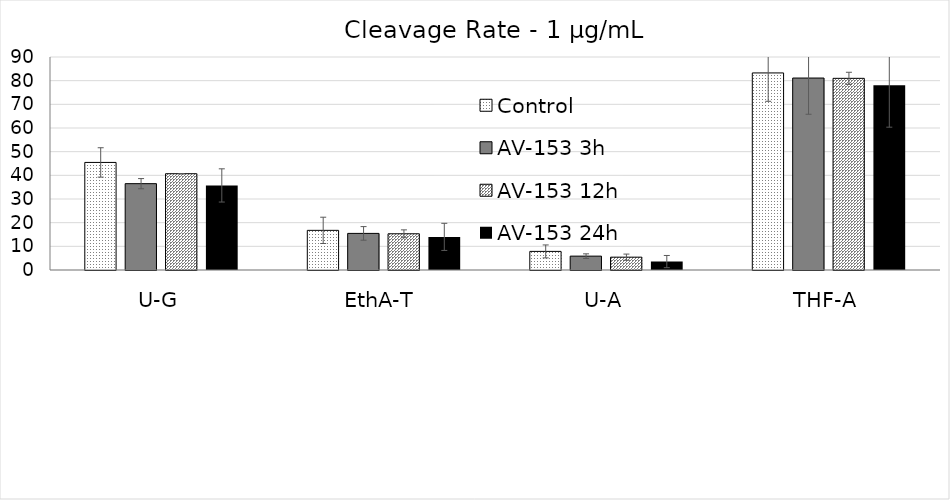
| Category | Control | AV-153 3h | AV-153 12h  | AV-153 24h  |
|---|---|---|---|---|
| U-G | 45.451 | 36.478 | 40.678 | 35.733 |
| EthA-T | 16.752 | 15.463 | 15.302 | 13.993 |
| U-A | 7.857 | 5.858 | 5.421 | 3.559 |
| THF-A | 83.27 | 81.111 | 80.986 | 78.036 |